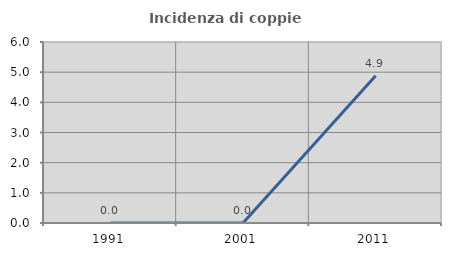
| Category | Incidenza di coppie miste |
|---|---|
| 1991.0 | 0 |
| 2001.0 | 0 |
| 2011.0 | 4.878 |